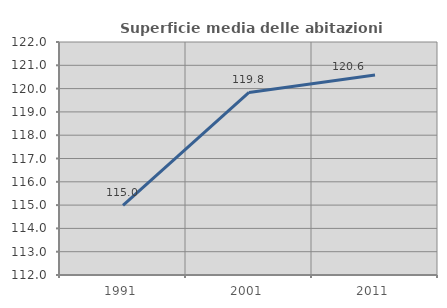
| Category | Superficie media delle abitazioni occupate |
|---|---|
| 1991.0 | 114.987 |
| 2001.0 | 119.835 |
| 2011.0 | 120.587 |